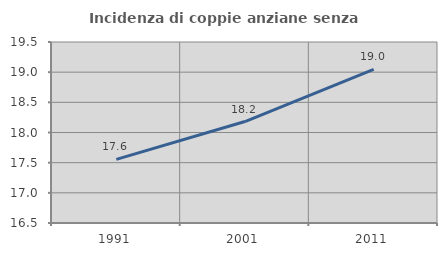
| Category | Incidenza di coppie anziane senza figli  |
|---|---|
| 1991.0 | 17.555 |
| 2001.0 | 18.182 |
| 2011.0 | 19.048 |